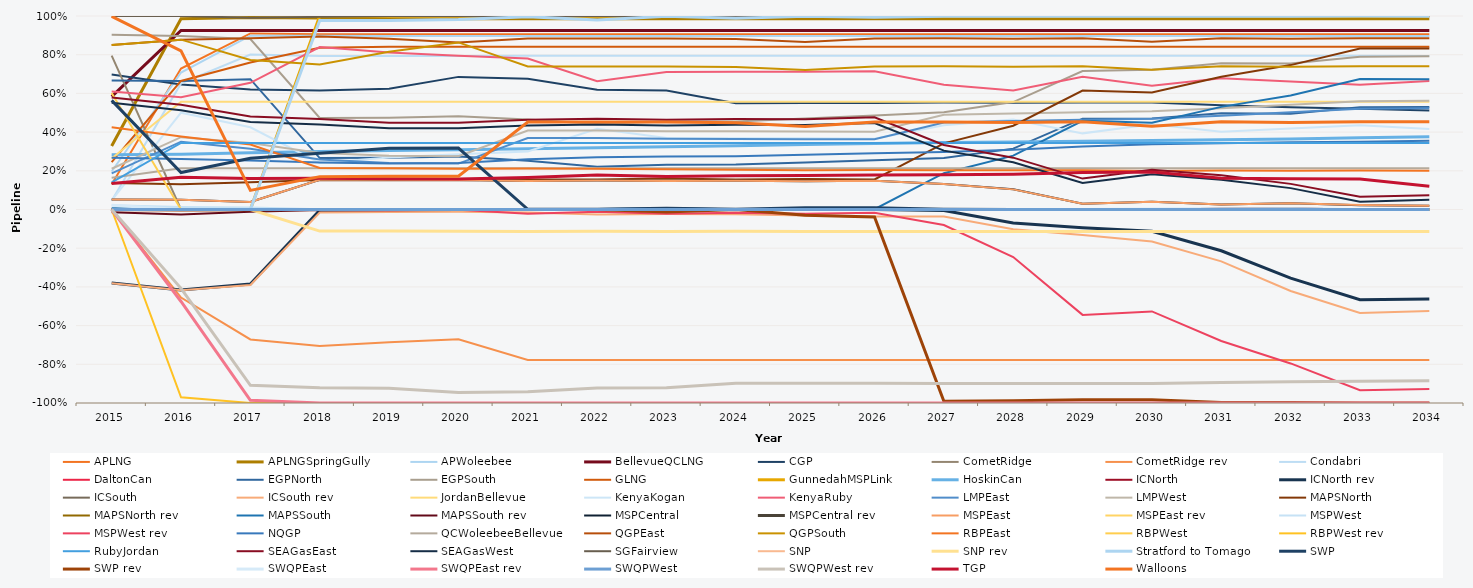
| Category | APLNG | APLNGSpringGully | APWoleebee | BellevueQCLNG | CGP | CometRidge | CometRidge rev | Condabri | DaltonCan | EGPNorth | EGPSouth | GLNG | GunnedahMSPLink | HoskinCan | ICNorth | ICNorth rev | ICSouth | ICSouth rev | JordanBellevue | KenyaKogan | KenyaRuby | LMPEast | LMPWest | MAPSNorth | MAPSNorth rev | MAPSSouth | MAPSSouth rev | MSPCentral | MSPCentral rev | MSPEast | MSPEast rev | MSPWest | MSPWest rev | NQGP | QCWoleebeeBellevue | QGPEast | QGPSouth | RBPEast | RBPWest | RBPWest rev | RubyJordan | SEAGasEast | SEAGasWest | SGFairview | SNP | SNP rev | Stratford to Tomago | SWP | SWP rev | SWQPEast | SWQPEast rev | SWQPWest | SWQPWest rev | TGP | Walloons |
|---|---|---|---|---|---|---|---|---|---|---|---|---|---|---|---|---|---|---|---|---|---|---|---|---|---|---|---|---|---|---|---|---|---|---|---|---|---|---|---|---|---|---|---|---|---|---|---|---|---|---|---|---|---|---|---|
| 2015.0 | 0.131 | 0.328 | 0.197 | 0.583 | 0.698 | 0.795 | 0 | 0.045 | 0 | 0.667 | 0.904 | 0.245 | 0 | 0.283 | 0 | -0.38 | 0 | -0.381 | 0.264 | 0.048 | 0.61 | 0.187 | 0.211 | 0.137 | 0 | 0.006 | -0.014 | 0.051 | 0 | 0.051 | 0 | 0.023 | 0 | 0.267 | 0.163 | 0.85 | 0.85 | 0.425 | 0.603 | 0 | 0.141 | 0.579 | 0.552 | 1 | 0 | 0 | 0 | 0.564 | 0 | 0.022 | 0 | 0 | 0 | 0.134 | 0.998 |
| 2016.0 | 0.728 | 0.986 | 0.708 | 0.925 | 0.646 | 0 | -0.455 | 0.652 | 0 | 0.664 | 0.897 | 0.664 | 0 | 0.286 | 0 | -0.416 | 0 | -0.418 | 0.557 | 0.5 | 0.58 | 0.35 | 0.374 | 0.13 | 0 | 0.004 | -0.026 | 0.051 | 0 | 0.051 | 0 | 0.012 | 0 | 0.261 | 0.213 | 0.878 | 0.878 | 0.377 | 0 | -0.97 | 0.344 | 0.541 | 0.512 | 1 | 0 | 0 | 0 | 0.191 | -0.002 | 0 | -0.475 | 0 | -0.407 | 0.167 | 0.82 |
| 2017.0 | 0.91 | 0.992 | 0.898 | 0.925 | 0.62 | 0 | -0.671 | 0.8 | 0 | 0.674 | 0.881 | 0.76 | 0 | 0.293 | 0 | -0.385 | 0 | -0.39 | 0.556 | 0.425 | 0.655 | 0.314 | 0.344 | 0.141 | 0 | 0.001 | -0.012 | 0.039 | 0 | 0.039 | 0 | 0.01 | 0 | 0.254 | 0.213 | 0.885 | 0.772 | 0.336 | 0 | -1 | 0.344 | 0.481 | 0.452 | 0.991 | 0 | 0 | 0 | 0.265 | -0.001 | 0 | -0.986 | 0 | -0.909 | 0.161 | 0.099 |
| 2018.0 | 0.906 | 0.989 | 0.897 | 0.925 | 0.616 | 0 | -0.706 | 0.793 | 0 | 0.266 | 0.473 | 0.836 | 1 | 0.299 | 0 | -0.003 | 0 | -0.016 | 0.556 | 0.241 | 0.839 | 0.258 | 0.292 | 0.153 | 0 | 0.002 | -0.003 | 0.154 | 0 | 0.154 | 0 | 0.001 | -0.003 | 0.243 | 0.213 | 0.894 | 0.749 | 0.214 | 0 | -1 | 0.344 | 0.468 | 0.439 | 0.995 | 0 | -0.112 | 0.977 | 0.291 | 0 | 0 | -1 | 0 | -0.921 | 0.162 | 0.17 |
| 2019.0 | 0.906 | 0.986 | 0.897 | 0.925 | 0.624 | 0 | -0.686 | 0.794 | 0 | 0.267 | 0.474 | 0.842 | 1 | 0.305 | 0 | -0.004 | 0 | -0.013 | 0.556 | 0.269 | 0.811 | 0.24 | 0.278 | 0.151 | 0 | 0.002 | -0.003 | 0.153 | 0 | 0.153 | 0 | 0.001 | -0.003 | 0.237 | 0.213 | 0.883 | 0.815 | 0.213 | 0 | -1 | 0.344 | 0.449 | 0.42 | 0.999 | 0 | -0.112 | 0.977 | 0.317 | 0 | 0 | -1 | 0 | -0.924 | 0.16 | 0.172 |
| 2020.0 | 0.906 | 0.986 | 0.897 | 0.925 | 0.685 | 0 | -0.671 | 0.794 | 0 | 0.274 | 0.482 | 0.842 | 1 | 0.309 | 0 | 0 | 0 | -0.012 | 0.556 | 0.286 | 0.794 | 0.237 | 0.276 | 0.151 | 0 | 0.002 | -0.003 | 0.153 | 0 | 0.153 | 0 | 0.001 | -0.002 | 0.24 | 0.213 | 0.864 | 0.864 | 0.21 | 0 | -1 | 0.344 | 0.449 | 0.42 | 1 | 0 | -0.112 | 0.981 | 0.317 | 0 | 0 | -1 | 0 | -0.946 | 0.158 | 0.172 |
| 2021.0 | 0.906 | 0.986 | 0.896 | 0.925 | 0.676 | 0 | -0.778 | 0.794 | 0 | 0.251 | 0.465 | 0.842 | 1 | 0.315 | 0 | 0 | 0 | -0.015 | 0.556 | 0.3 | 0.78 | 0.369 | 0.408 | 0.155 | 0 | 0.002 | 0 | 0.147 | 0 | 0.147 | 0 | 0.001 | -0.022 | 0.259 | 0.213 | 0.884 | 0.739 | 0.212 | 0 | -1 | 0.344 | 0.463 | 0.434 | 1 | 0 | -0.114 | 0.996 | 0.001 | -0.001 | 0 | -1 | 0 | -0.942 | 0.165 | 0.452 |
| 2022.0 | 0.906 | 0.986 | 0.896 | 0.925 | 0.618 | 0 | -0.778 | 0.794 | 0 | 0.221 | 0.441 | 0.842 | 1 | 0.319 | 0 | 0 | 0 | -0.025 | 0.556 | 0.417 | 0.663 | 0.369 | 0.408 | 0.155 | 0 | 0.002 | 0 | 0.15 | 0 | 0.15 | 0 | 0.001 | -0.011 | 0.27 | 0.213 | 0.884 | 0.739 | 0.211 | 0 | -1 | 0.344 | 0.469 | 0.44 | 1 | 0 | -0.112 | 0.979 | 0.001 | 0 | 0 | -1 | 0 | -0.922 | 0.179 | 0.452 |
| 2023.0 | 0.906 | 0.986 | 0.896 | 0.925 | 0.615 | 0 | -0.778 | 0.794 | 0 | 0.232 | 0.454 | 0.842 | 1 | 0.324 | 0 | 0 | 0 | -0.023 | 0.556 | 0.369 | 0.711 | 0.366 | 0.405 | 0.16 | 0 | 0.007 | 0 | 0.147 | 0 | 0.147 | 0 | 0.001 | -0.022 | 0.273 | 0.213 | 0.884 | 0.739 | 0.208 | 0 | -1 | 0.344 | 0.464 | 0.434 | 1 | 0 | -0.114 | 0.999 | 0.007 | -0.012 | 0 | -1 | 0 | -0.921 | 0.17 | 0.452 |
| 2024.0 | 0.906 | 0.986 | 0.896 | 0.925 | 0.549 | 0 | -0.778 | 0.794 | 0 | 0.232 | 0.455 | 0.842 | 1 | 0.329 | 0 | 0 | 0 | -0.025 | 0.556 | 0.368 | 0.712 | 0.365 | 0.404 | 0.155 | 0 | 0.002 | 0 | 0.148 | 0 | 0.148 | 0 | 0.002 | -0.016 | 0.276 | 0.213 | 0.882 | 0.737 | 0.206 | 0 | -1 | 0.344 | 0.468 | 0.438 | 1 | 0 | -0.113 | 0.988 | 0.001 | 0 | 0 | -1 | 0 | -0.898 | 0.174 | 0.448 |
| 2025.0 | 0.906 | 0.986 | 0.896 | 0.925 | 0.55 | 0 | -0.778 | 0.794 | 0.001 | 0.243 | 0.47 | 0.842 | 1 | 0.336 | 0 | 0 | 0 | -0.03 | 0.556 | 0.368 | 0.712 | 0.363 | 0.403 | 0.158 | 0 | 0.004 | 0 | 0.147 | 0 | 0.147 | 0 | 0.002 | -0.022 | 0.283 | 0.213 | 0.866 | 0.721 | 0.203 | 0 | -1 | 0.344 | 0.466 | 0.437 | 1 | 0 | -0.114 | 0.999 | 0.009 | -0.03 | 0 | -1 | 0 | -0.898 | 0.175 | 0.429 |
| 2026.0 | 0.906 | 0.986 | 0.896 | 0.925 | 0.55 | 0 | -0.778 | 0.794 | 0.001 | 0.254 | 0.485 | 0.842 | 1 | 0.341 | 0 | 0 | 0 | -0.036 | 0.556 | 0.366 | 0.714 | 0.363 | 0.402 | 0.155 | 0 | 0.002 | 0 | 0.148 | 0 | 0.148 | 0 | 0.003 | -0.017 | 0.29 | 0.213 | 0.884 | 0.74 | 0.204 | 0 | -1 | 0.344 | 0.476 | 0.447 | 1 | 0 | -0.114 | 0.993 | 0.009 | -0.038 | 0 | -1 | 0 | -0.899 | 0.178 | 0.452 |
| 2027.0 | 0.906 | 0.986 | 0.896 | 0.925 | 0.553 | 0 | -0.778 | 0.794 | 0.001 | 0.267 | 0.503 | 0.842 | 1 | 0.346 | 0 | -0.005 | 0 | -0.037 | 0.556 | 0.435 | 0.645 | 0.45 | 0.489 | 0.342 | 0 | 0.187 | 0 | 0.131 | 0 | 0.131 | 0 | 0.002 | -0.08 | 0.297 | 0.213 | 0.885 | 0.74 | 0.203 | 0 | -1 | 0.344 | 0.333 | 0.304 | 1 | 0 | -0.114 | 0.999 | 0.001 | -0.991 | 0 | -1 | 0 | -0.899 | 0.18 | 0.452 |
| 2028.0 | 0.906 | 0.986 | 0.896 | 0.925 | 0.551 | 0 | -0.778 | 0.794 | 0.001 | 0.315 | 0.555 | 0.842 | 1 | 0.348 | 0 | -0.07 | 0 | -0.102 | 0.556 | 0.465 | 0.615 | 0.457 | 0.497 | 0.433 | 0 | 0.278 | 0 | 0.104 | 0 | 0.104 | 0 | 0.002 | -0.246 | 0.309 | 0.213 | 0.882 | 0.738 | 0.202 | 0 | -1 | 0.344 | 0.268 | 0.244 | 1 | 0 | -0.114 | 0.999 | 0 | -0.988 | 0 | -1 | 0 | -0.899 | 0.183 | 0.449 |
| 2029.0 | 0.906 | 0.986 | 0.896 | 0.925 | 0.553 | 0 | -0.778 | 0.794 | 0.001 | 0.47 | 0.716 | 0.842 | 1 | 0.353 | 0 | -0.094 | 0 | -0.132 | 0.556 | 0.393 | 0.687 | 0.464 | 0.503 | 0.615 | 0 | 0.458 | 0 | 0.03 | 0 | 0.03 | 0 | 0.003 | -0.545 | 0.325 | 0.213 | 0.885 | 0.74 | 0.203 | 0 | -1 | 0.344 | 0.16 | 0.138 | 1 | 0 | -0.114 | 0.999 | 0 | -0.983 | 0 | -1 | 0 | -0.899 | 0.192 | 0.453 |
| 2030.0 | 0.906 | 0.986 | 0.896 | 0.925 | 0.553 | 0 | -0.778 | 0.794 | 0.001 | 0.47 | 0.722 | 0.842 | 1 | 0.356 | 0 | -0.112 | 0 | -0.165 | 0.556 | 0.441 | 0.639 | 0.469 | 0.508 | 0.604 | 0 | 0.449 | 0 | 0.04 | 0 | 0.04 | 0 | 0.004 | -0.527 | 0.338 | 0.213 | 0.867 | 0.722 | 0.2 | 0 | -1 | 0.344 | 0.206 | 0.182 | 1 | 0 | -0.114 | 0.999 | 0 | -0.984 | 0 | -1 | 0 | -0.899 | 0.194 | 0.43 |
| 2031.0 | 0.906 | 0.986 | 0.896 | 0.925 | 0.538 | 0 | -0.778 | 0.794 | 0.001 | 0.497 | 0.755 | 0.842 | 1 | 0.36 | 0.004 | -0.213 | 0.003 | -0.268 | 0.556 | 0.402 | 0.678 | 0.485 | 0.524 | 0.686 | 0 | 0.53 | 0 | 0.025 | 0 | 0.025 | 0 | 0.005 | -0.68 | 0.342 | 0.213 | 0.885 | 0.74 | 0.201 | 0 | -1 | 0.344 | 0.177 | 0.154 | 1 | 0 | -0.114 | 0.999 | 0 | -0.997 | 0 | -1 | 0 | -0.894 | 0.162 | 0.453 |
| 2032.0 | 0.906 | 0.986 | 0.896 | 0.925 | 0.528 | 0 | -0.778 | 0.794 | 0.001 | 0.495 | 0.755 | 0.842 | 1 | 0.365 | 0.005 | -0.355 | 0.005 | -0.421 | 0.556 | 0.418 | 0.662 | 0.503 | 0.542 | 0.746 | 0 | 0.589 | 0 | 0.033 | 0 | 0.033 | 0 | 0.006 | -0.795 | 0.347 | 0.213 | 0.883 | 0.738 | 0.2 | 0 | -1 | 0.344 | 0.132 | 0.11 | 1 | 0 | -0.114 | 0.999 | 0 | -0.997 | 0 | -1 | 0 | -0.891 | 0.159 | 0.45 |
| 2033.0 | 0.906 | 0.986 | 0.896 | 0.925 | 0.52 | 0 | -0.778 | 0.794 | 0.001 | 0.529 | 0.789 | 0.842 | 1 | 0.37 | 0 | -0.467 | 0 | -0.535 | 0.556 | 0.435 | 0.645 | 0.521 | 0.56 | 0.832 | 0 | 0.674 | 0 | 0.022 | 0 | 0.024 | 0 | 0.002 | -0.934 | 0.351 | 0.213 | 0.885 | 0.741 | 0.201 | 0 | -1 | 0.344 | 0.066 | 0.041 | 1 | 0 | -0.114 | 0.999 | 0 | -1 | 0 | -1 | 0 | -0.888 | 0.158 | 0.453 |
| 2034.0 | 0.906 | 0.986 | 0.897 | 0.925 | 0.511 | 0 | -0.778 | 0.794 | 0.001 | 0.53 | 0.793 | 0.842 | 1 | 0.376 | 0 | -0.462 | 0 | -0.524 | 0.556 | 0.416 | 0.664 | 0.523 | 0.562 | 0.832 | 0 | 0.673 | 0 | 0.019 | 0 | 0.019 | 0 | 0 | -0.927 | 0.356 | 0.213 | 0.886 | 0.741 | 0.2 | 0 | -1 | 0.344 | 0.074 | 0.05 | 1 | 0 | -0.114 | 0.999 | 0 | -1 | 0 | -1 | 0 | -0.885 | 0.121 | 0.454 |